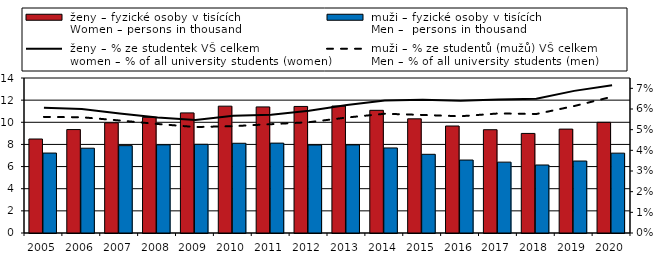
| Category |  ženy – fyzické osoby v tisících
 Women – persons in thousand |  muži – fyzické osoby v tisících
 Men –  persons in thousand |
|---|---|---|
| 2005.0 | 8.489 | 7.221 |
| 2006.0 | 9.343 | 7.658 |
| 2007.0 | 9.953 | 7.891 |
| 2008.0 | 10.449 | 7.963 |
| 2009.0 | 10.848 | 8.012 |
| 2010.0 | 11.456 | 8.106 |
| 2011.0 | 11.389 | 8.119 |
| 2012.0 | 11.431 | 7.947 |
| 2013.0 | 11.469 | 7.957 |
| 2014.0 | 11.081 | 7.683 |
| 2015.0 | 10.313 | 7.108 |
| 2016.0 | 9.664 | 6.59 |
| 2017.0 | 9.329 | 6.401 |
| 2018.0 | 8.993 | 6.142 |
| 2019.0 | 9.384 | 6.501 |
| 2020.0 | 9.996 | 7.212 |